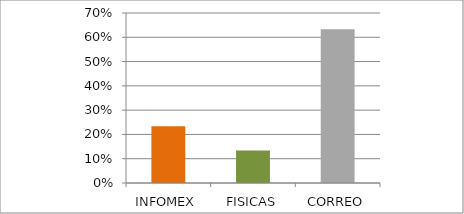
| Category | Series 0 |
|---|---|
| INFOMEX | 0.233 |
| FISICAS | 0.133 |
| CORREO | 0.633 |